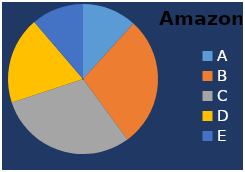
| Category | Amazon |
|---|---|
| A | 125 |
| B | 300 |
| C | 320 |
| D | 200 |
| E | 120 |